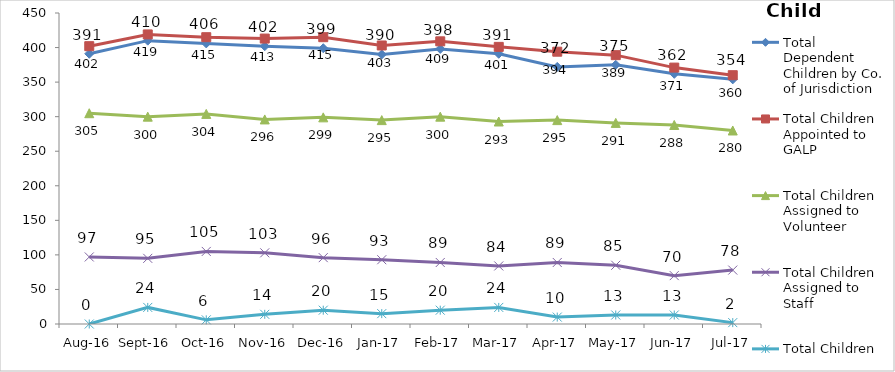
| Category | Total Dependent Children by Co. of Jurisdiction | Total Children Appointed to GALP | Total Children Assigned to Volunteer | Total Children Assigned to Staff | Total Children Unassigned |
|---|---|---|---|---|---|
| Aug-16 | 391 | 402 | 305 | 97 | 0 |
| Sep-16 | 410 | 419 | 300 | 95 | 24 |
| Oct-16 | 406 | 415 | 304 | 105 | 6 |
| Nov-16 | 402 | 413 | 296 | 103 | 14 |
| Dec-16 | 399 | 415 | 299 | 96 | 20 |
| Jan-17 | 390 | 403 | 295 | 93 | 15 |
| Feb-17 | 398 | 409 | 300 | 89 | 20 |
| Mar-17 | 391 | 401 | 293 | 84 | 24 |
| Apr-17 | 372 | 394 | 295 | 89 | 10 |
| May-17 | 375 | 389 | 291 | 85 | 13 |
| Jun-17 | 362 | 371 | 288 | 70 | 13 |
| Jul-17 | 354 | 360 | 280 | 78 | 2 |